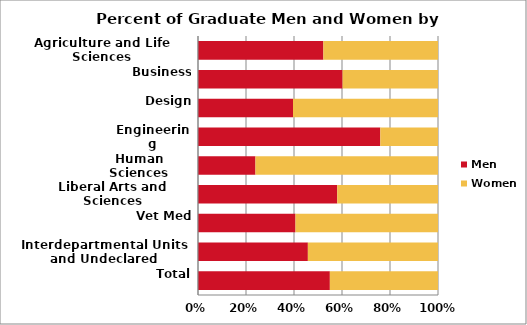
| Category | Men | Women |
|---|---|---|
| Agriculture and Life Sciences | 303 | 277 |
| Business | 244 | 161 |
| Design | 57 | 87 |
| Engineering | 812 | 257 |
| Human Sciences | 147 | 467 |
| Liberal Arts and Sciences | 622 | 450 |
| Vet Med | 65 | 95 |
| Interdepartmental Units and Undeclared | 141 | 167 |
| Total | 2391 | 1961 |